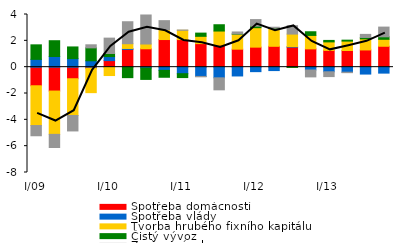
| Category | Spotřeba domácností | Spotřeba vlády | Tvorba hrubého fixního kapitálu | Čistý vývoz | Změna zásob |
|---|---|---|---|---|---|
| I/09 | -1.413 | 0.594 | -3.02 | 1.102 | -0.776 |
| II | -1.814 | 0.808 | -3.289 | 1.201 | -0.997 |
| III | -0.879 | 0.65 | -2.791 | 0.886 | -1.173 |
| IV | -0.084 | 0.486 | -1.85 | 0.98 | 0.233 |
| I/10 | 0.5 | 0.305 | -0.636 | 0.234 | 1.168 |
| II | 1.35 | 0.071 | 0.361 | -0.795 | 1.668 |
| III | 1.396 | -0.066 | 0.364 | -0.864 | 2.204 |
| IV | 2.098 | -0.243 | 0.75 | -0.524 | 0.685 |
| I/11 | 2.096 | -0.495 | 0.704 | -0.295 | 0.021 |
| II | 1.789 | -0.704 | 0.554 | 0.244 | -0.028 |
| III | 1.673 | -0.811 | 1.071 | 0.478 | -0.91 |
| IV | 1.366 | -0.668 | 1.14 | 0.019 | 0.149 |
| I/12 | 1.521 | -0.34 | 1.478 | 0.117 | 0.499 |
| II | 1.585 | -0.259 | 1.356 | 0.02 | 0.073 |
| III | 1.521 | 0.037 | 0.954 | -0.017 | 0.637 |
| IV | 1.389 | -0.216 | 1.022 | 0.279 | -0.522 |
| I/13 | 1.276 | -0.35 | 0.645 | 0.111 | -0.365 |
| II | 1.265 | -0.382 | 0.716 | 0.07 | -0.035 |
| III | 1.308 | -0.524 | 0.84 | 0.108 | 0.234 |
| IV | 1.588 | -0.452 | 0.528 | 0.189 | 0.739 |